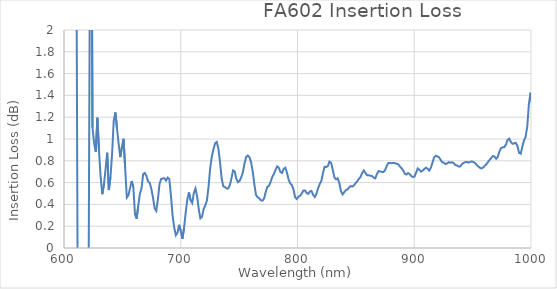
| Category | Series 0 |
|---|---|
| 355.6 | -12.475 |
| 357.0 | -5.149 |
| 358.4 | 5.273 |
| 359.8 | 20.017 |
| 361.2 | 34.593 |
| 362.6 | 42.109 |
| 364.0 | 31.907 |
| 365.4 | 35.288 |
| 366.8 | 31.769 |
| 368.2 | 21.881 |
| 369.6 | 14.716 |
| 371.0 | 4.2 |
| 372.4 | -5.747 |
| 373.8 | 8.65 |
| 375.2 | 8.643 |
| 376.6 | 4.934 |
| 378.0 | 0.977 |
| 379.4 | -2.68 |
| 380.8 | -2.784 |
| 382.2 | 0.235 |
| 383.6 | -3.64 |
| 385.0 | -7.265 |
| 386.4 | -3.585 |
| 387.8 | -10.357 |
| 389.2 | -6.478 |
| 390.6 | -2.831 |
| 392.0 | -6.147 |
| 393.4 | -9.588 |
| 394.8 | -5.664 |
| 396.2 | -5.493 |
| 397.6 | 11.924 |
| 399.0 | 11.547 |
| 400.4 | 11.53 |
| 401.8 | 22.085 |
| 403.2 | 25.629 |
| 404.6 | 14.497 |
| 406.0 | 7.05 |
| 407.4 | -0.007 |
| 408.8 | 3.761 |
| 410.2 | 8.017 |
| 411.6 | 11.542 |
| 413.0 | 1.079 |
| 414.4 | 1.284 |
| 415.8 | 4.873 |
| 417.2 | 4.856 |
| 418.6 | 4.667 |
| 420.0 | 6.533 |
| 421.4 | -1.03 |
| 422.8 | 5.857 |
| 424.2 | 20.126 |
| 425.6 | 23.821 |
| 427.0 | 23.746 |
| 428.4 | 13.81 |
| 429.8 | 11.035 |
| 431.2 | 4.179 |
| 432.6 | 7.481 |
| 434.0 | 10.685 |
| 435.4 | 10.771 |
| 436.8 | 18.04 |
| 438.2 | 21.395 |
| 439.6 | 14.895 |
| 441.0 | 11.885 |
| 442.4 | 15.489 |
| 443.8 | 8.804 |
| 445.2 | 5.662 |
| 446.6 | -4.639 |
| 448.0 | -1.38 |
| 449.4 | -1.157 |
| 450.8 | 9.169 |
| 452.2 | 2.187 |
| 453.6 | -4.588 |
| 455.0 | -4.909 |
| 456.4 | -8.916 |
| 457.8 | -19.832 |
| 459.2 | -17.027 |
| 460.6 | -20.219 |
| 462.0 | -12.741 |
| 463.4 | -9.546 |
| 464.8 | -6.248 |
| 466.2 | -6.088 |
| 467.6 | 5.15 |
| 469.0 | 19.215 |
| 470.4 | 22.183 |
| 471.8 | 11.186 |
| 473.2 | 21.516 |
| 474.6 | 28.773 |
| 476.0 | 46.771 |
| 477.4 | 50.262 |
| 478.8 | 42.88 |
| 480.2 | 42.836 |
| 481.6 | 53.231 |
| 483.0 | 49.815 |
| 484.4 | 35.627 |
| 485.8 | 21.128 |
| 487.2 | 13.645 |
| 488.6 | 6.838 |
| 490.0 | -3.842 |
| 491.4 | -14.295 |
| 492.8 | -24.955 |
| 494.2 | -25.079 |
| 495.6 | -24.687 |
| 497.0 | -17.643 |
| 498.4 | -6.627 |
| 499.8 | 14.721 |
| 501.2 | 28.531 |
| 502.6 | 31.545 |
| 504.0 | 38.136 |
| 505.4 | 41.372 |
| 506.8 | 34.602 |
| 508.2 | 27.647 |
| 509.6 | 10.55 |
| 511.0 | 0.227 |
| 512.4 | 0.791 |
| 513.8 | 1.543 |
| 515.2 | -2.099 |
| 516.6 | -9.316 |
| 518.0 | -23.454 |
| 519.4 | -27.318 |
| 520.8 | -30.835 |
| 522.2 | -38.31 |
| 523.6 | -42.491 |
| 525.0 | -35.283 |
| 526.4 | -28.549 |
| 527.8 | -29.213 |
| 529.2 | -30.128 |
| 530.6 | -30.352 |
| 532.0 | -23.186 |
| 533.4 | -8.47 |
| 534.8 | -1.672 |
| 536.2 | -5.12 |
| 537.6 | 5.735 |
| 539.0 | 16.53 |
| 540.4 | 16.678 |
| 541.8 | 16.805 |
| 543.2 | -1.101 |
| 544.6 | -14.822 |
| 546.0 | -11.28 |
| 547.4 | -21.973 |
| 548.8 | -35.906 |
| 550.2 | -36.291 |
| 551.6 | -40.059 |
| 553.0 | -36.523 |
| 554.4 | -40.578 |
| 555.8 | -40.736 |
| 557.2 | -37.196 |
| 558.6 | -25.962 |
| 560.0 | -21.942 |
| 561.4 | -14.295 |
| 562.8 | -13.75 |
| 564.2 | 0.108 |
| 565.6 | 7.254 |
| 567.0 | 14.549 |
| 568.4 | 7.208 |
| 569.8 | 3.955 |
| 571.2 | -6.875 |
| 572.6 | -7.42 |
| 574.0 | -17.272 |
| 575.4 | -31.381 |
| 576.8 | -35.025 |
| 578.2 | -31.855 |
| 579.6 | -28.606 |
| 581.0 | -24.596 |
| 582.4 | -24.435 |
| 583.8 | -20.877 |
| 585.2 | -6.57 |
| 586.6 | 4.055 |
| 588.0 | 8.086 |
| 589.4 | 12.012 |
| 590.8 | 22.654 |
| 592.2 | 30.337 |
| 593.6 | 37.868 |
| 595.0 | 38.292 |
| 596.4 | 31.766 |
| 597.8 | 31.636 |
| 599.2 | 31.593 |
| 600.6 | 31.749 |
| 602.0 | 24.585 |
| 603.4 | 20.218 |
| 604.8 | 16.307 |
| 606.2 | 15.876 |
| 607.6 | 15.624 |
| 609.0 | 11.469 |
| 610.4 | 3.466 |
| 611.8 | -0.685 |
| 613.2 | -7.441 |
| 614.6 | -3.85 |
| 616.0 | -3.768 |
| 617.4 | -3.542 |
| 618.8 | -3.165 |
| 620.2 | -2.665 |
| 621.6 | 1.079 |
| 623.0 | 4.672 |
| 624.4 | 1.105 |
| 625.8 | 0.962 |
| 627.2 | 0.882 |
| 628.6 | 1.195 |
| 630.0 | 0.89 |
| 631.4 | 0.647 |
| 632.8 | 0.494 |
| 634.2 | 0.583 |
| 635.6 | 0.721 |
| 637.0 | 0.875 |
| 638.4 | 0.532 |
| 639.8 | 0.651 |
| 641.2 | 0.864 |
| 642.6 | 1.168 |
| 644.0 | 1.243 |
| 645.4 | 1.097 |
| 646.8 | 0.955 |
| 648.2 | 0.834 |
| 649.6 | 0.926 |
| 651.0 | 1.002 |
| 652.4 | 0.732 |
| 653.8 | 0.463 |
| 655.2 | 0.483 |
| 656.6 | 0.551 |
| 658.0 | 0.614 |
| 659.4 | 0.556 |
| 660.8 | 0.309 |
| 662.2 | 0.269 |
| 663.6 | 0.387 |
| 665.0 | 0.497 |
| 666.4 | 0.548 |
| 667.8 | 0.678 |
| 669.2 | 0.688 |
| 670.6 | 0.661 |
| 672.0 | 0.611 |
| 673.4 | 0.598 |
| 674.8 | 0.544 |
| 676.2 | 0.464 |
| 677.6 | 0.365 |
| 679.0 | 0.34 |
| 680.4 | 0.442 |
| 681.8 | 0.586 |
| 683.2 | 0.633 |
| 684.6 | 0.639 |
| 686.0 | 0.64 |
| 687.4 | 0.619 |
| 688.8 | 0.645 |
| 690.2 | 0.633 |
| 691.6 | 0.481 |
| 693.0 | 0.3 |
| 694.4 | 0.187 |
| 695.8 | 0.117 |
| 697.2 | 0.14 |
| 698.6 | 0.213 |
| 700.0 | 0.156 |
| 701.4 | 0.084 |
| 702.8 | 0.181 |
| 704.2 | 0.322 |
| 705.6 | 0.444 |
| 707.0 | 0.51 |
| 708.4 | 0.44 |
| 709.8 | 0.413 |
| 711.2 | 0.505 |
| 712.6 | 0.546 |
| 714.0 | 0.475 |
| 715.4 | 0.357 |
| 716.8 | 0.271 |
| 718.2 | 0.286 |
| 719.6 | 0.357 |
| 721.0 | 0.392 |
| 722.4 | 0.434 |
| 723.8 | 0.562 |
| 725.2 | 0.73 |
| 726.6 | 0.838 |
| 728.0 | 0.905 |
| 729.4 | 0.96 |
| 730.8 | 0.973 |
| 732.2 | 0.914 |
| 733.6 | 0.791 |
| 735.0 | 0.641 |
| 736.4 | 0.566 |
| 737.8 | 0.56 |
| 739.2 | 0.545 |
| 740.6 | 0.545 |
| 742.0 | 0.575 |
| 743.4 | 0.637 |
| 744.8 | 0.712 |
| 746.2 | 0.704 |
| 747.6 | 0.634 |
| 749.0 | 0.604 |
| 750.4 | 0.615 |
| 751.8 | 0.649 |
| 753.2 | 0.694 |
| 754.6 | 0.775 |
| 756.0 | 0.835 |
| 757.4 | 0.848 |
| 758.8 | 0.833 |
| 760.2 | 0.79 |
| 761.6 | 0.705 |
| 763.0 | 0.588 |
| 764.4 | 0.488 |
| 765.8 | 0.466 |
| 767.2 | 0.455 |
| 768.6 | 0.437 |
| 770.0 | 0.434 |
| 771.4 | 0.455 |
| 772.8 | 0.514 |
| 774.2 | 0.562 |
| 775.6 | 0.57 |
| 777.0 | 0.607 |
| 778.4 | 0.652 |
| 779.8 | 0.68 |
| 781.2 | 0.717 |
| 782.6 | 0.749 |
| 784.0 | 0.735 |
| 785.4 | 0.696 |
| 786.8 | 0.689 |
| 788.2 | 0.727 |
| 789.6 | 0.737 |
| 791.0 | 0.69 |
| 792.4 | 0.628 |
| 793.8 | 0.591 |
| 795.2 | 0.579 |
| 796.6 | 0.535 |
| 798.0 | 0.465 |
| 799.4 | 0.45 |
| 800.8 | 0.469 |
| 802.2 | 0.479 |
| 803.6 | 0.498 |
| 805.0 | 0.526 |
| 806.4 | 0.528 |
| 807.8 | 0.504 |
| 809.2 | 0.496 |
| 810.6 | 0.519 |
| 812.0 | 0.524 |
| 813.4 | 0.487 |
| 814.8 | 0.467 |
| 816.2 | 0.495 |
| 817.6 | 0.548 |
| 819.0 | 0.585 |
| 820.4 | 0.615 |
| 821.8 | 0.685 |
| 823.2 | 0.745 |
| 824.6 | 0.743 |
| 826.0 | 0.751 |
| 827.4 | 0.793 |
| 828.8 | 0.782 |
| 830.2 | 0.716 |
| 831.6 | 0.649 |
| 833.0 | 0.63 |
| 834.4 | 0.639 |
| 835.8 | 0.598 |
| 837.2 | 0.521 |
| 838.6 | 0.491 |
| 840.0 | 0.512 |
| 841.4 | 0.53 |
| 842.8 | 0.537 |
| 844.2 | 0.556 |
| 845.6 | 0.568 |
| 847.0 | 0.564 |
| 848.4 | 0.575 |
| 849.8 | 0.596 |
| 851.2 | 0.612 |
| 852.6 | 0.635 |
| 854.0 | 0.652 |
| 855.4 | 0.688 |
| 856.8 | 0.712 |
| 858.2 | 0.688 |
| 859.6 | 0.668 |
| 861.0 | 0.668 |
| 862.4 | 0.662 |
| 863.8 | 0.661 |
| 865.2 | 0.645 |
| 866.6 | 0.639 |
| 868.0 | 0.677 |
| 869.4 | 0.705 |
| 870.8 | 0.703 |
| 872.2 | 0.698 |
| 873.6 | 0.696 |
| 875.0 | 0.714 |
| 876.4 | 0.752 |
| 877.8 | 0.78 |
| 879.2 | 0.78 |
| 880.6 | 0.778 |
| 882.0 | 0.78 |
| 883.4 | 0.778 |
| 884.8 | 0.773 |
| 886.2 | 0.768 |
| 887.6 | 0.749 |
| 889.0 | 0.733 |
| 890.4 | 0.715 |
| 891.8 | 0.683 |
| 893.2 | 0.674 |
| 894.6 | 0.688 |
| 896.0 | 0.679 |
| 897.4 | 0.66 |
| 898.8 | 0.651 |
| 900.2 | 0.655 |
| 901.6 | 0.692 |
| 903.0 | 0.73 |
| 904.4 | 0.716 |
| 905.8 | 0.701 |
| 907.2 | 0.71 |
| 908.6 | 0.724 |
| 910.0 | 0.737 |
| 911.4 | 0.728 |
| 912.8 | 0.71 |
| 914.2 | 0.735 |
| 915.6 | 0.784 |
| 917.0 | 0.83 |
| 918.4 | 0.847 |
| 919.8 | 0.84 |
| 921.2 | 0.833 |
| 922.6 | 0.808 |
| 924.0 | 0.786 |
| 925.4 | 0.782 |
| 926.8 | 0.77 |
| 928.2 | 0.776 |
| 929.6 | 0.788 |
| 931.0 | 0.782 |
| 932.4 | 0.786 |
| 933.8 | 0.779 |
| 935.2 | 0.761 |
| 936.6 | 0.757 |
| 938.0 | 0.748 |
| 939.4 | 0.749 |
| 940.8 | 0.769 |
| 942.2 | 0.78 |
| 943.6 | 0.788 |
| 945.0 | 0.79 |
| 946.4 | 0.783 |
| 947.8 | 0.789 |
| 949.2 | 0.795 |
| 950.6 | 0.789 |
| 952.0 | 0.78 |
| 953.4 | 0.764 |
| 954.8 | 0.748 |
| 956.2 | 0.736 |
| 957.6 | 0.73 |
| 959.0 | 0.739 |
| 960.4 | 0.754 |
| 961.8 | 0.769 |
| 963.2 | 0.79 |
| 964.6 | 0.808 |
| 966.0 | 0.826 |
| 967.4 | 0.844 |
| 968.8 | 0.839 |
| 970.2 | 0.819 |
| 971.6 | 0.837 |
| 973.0 | 0.888 |
| 974.4 | 0.918 |
| 975.8 | 0.923 |
| 977.2 | 0.926 |
| 978.6 | 0.95 |
| 980.0 | 0.993 |
| 981.4 | 1.003 |
| 982.8 | 0.972 |
| 984.2 | 0.956 |
| 985.6 | 0.961 |
| 987.0 | 0.965 |
| 988.4 | 0.934 |
| 989.8 | 0.872 |
| 991.2 | 0.865 |
| 992.6 | 0.931 |
| 994.0 | 0.986 |
| 995.4 | 1.022 |
| 996.8 | 1.115 |
| 998.2 | 1.322 |
| 999.6 | 1.425 |
| 1001.0 | 1.316 |
| 1002.4 | 1.173 |
| 1003.8 | 1.114 |
| 1005.2 | 1.072 |
| 1006.6 | 0.935 |
| 1008.0 | 0.57 |
| 1009.4 | 0.209 |
| 1010.8 | -0.3 |
| 1012.2 | -3.416 |
| 1013.6 | -3.239 |
| 1015.0 | -3.256 |
| 1016.4 | 3.564 |
| 1017.8 | 7.424 |
| 1019.2 | 14.491 |
| 1020.6 | 14.978 |
| 1022.0 | 14.805 |
| 1023.4 | 11.521 |
| 1024.8 | 8.148 |
| 1026.2 | -2.098 |
| 1027.6 | -9.616 |
| 1029.0 | -16.646 |
| 1030.4 | -19.781 |
| 1031.8 | -16.428 |
| 1033.2 | -13.809 |
| 1034.6 | -11.032 |
| 1036.0 | -7.563 |
| 1037.4 | -3.944 |
| 1038.8 | -0.866 |
| 1040.2 | -1.434 |
| 1041.6 | 5.06 |
| 1043.0 | 2.26 |
| 1044.4 | -1.019 |
| 1045.8 | -14.19 |
| 1047.2 | -20.843 |
| 1048.6 | -27.17 |
| 1050.0 | -26.937 |
| 1051.4 | -43.47 |
| 1052.8 | -47.011 |
| 1054.2 | -46.705 |
| 1055.6 | -37.038 |
| 1057.0 | -33.669 |
| 1058.4 | -26.814 |
| 1059.8 | -26.213 |
| 1061.2 | -19.526 |
| 1062.6 | -5.953 |
| 1064.0 | 0.758 |
| 1065.4 | 4.18 |
| 1066.8 | 1.24 |
| 1068.2 | -9.138 |
| 1069.6 | -13.127 |
| 1071.0 | -13.071 |
| 1072.4 | -22.857 |
| 1073.8 | -22.642 |
| 1075.2 | -22.745 |
| 1076.6 | -13.054 |
| 1078.0 | -12.526 |
| 1079.4 | -12.578 |
| 1080.8 | -12.62 |
| 1082.2 | -9.658 |
| 1083.6 | -9.718 |
| 1085.0 | -6.512 |
| 1086.4 | -6.682 |
| 1087.8 | -0.207 |
| 1089.2 | 3.414 |
| 1090.6 | 6.715 |
| 1092.0 | 13.514 |
| 1093.4 | 20.64 |
| 1094.8 | 24.435 |
| 1096.2 | 17.866 |
| 1097.6 | 11.001 |
| 1099.0 | 3.962 |
| 1100.4 | -6.312 |
| 1101.8 | -20.264 |
| 1103.2 | -30.745 |
| 1104.6 | -37.858 |
| 1106.0 | -28.316 |
| 1107.4 | -18.263 |
| 1108.8 | -1.445 |
| 1110.2 | 8.806 |
| 1111.6 | 16.125 |
| 1113.0 | 22.538 |
| 1114.4 | 19.2 |
| 1115.8 | 6.38 |
| 1117.2 | -6.7 |
| 1118.6 | -13.233 |
| 1120.0 | -6.505 |
| 1121.4 | 0.232 |
| 1122.8 | 4.073 |
| 1124.2 | 11.159 |
| 1125.6 | 27.803 |
| 1127.0 | 44.403 |
| 1128.4 | 47.813 |
| 1129.8 | 44.474 |
| 1131.2 | 37.522 |
| 1132.6 | 33.63 |
| 1134.0 | 26.588 |
| 1135.4 | 12.896 |
| 1136.8 | -0.523 |
| 1138.2 | -3.894 |
| 1139.6 | -7.52 |
| 1141.0 | -10.854 |
| 1142.4 | -17.353 |
| 1143.8 | -17.535 |
| 1145.2 | -10.502 |
| 1146.6 | -7.233 |
| 1148.0 | -3.927 |
| 1149.4 | -10.507 |
| 1150.8 | -7.696 |
| 1152.2 | -14.405 |
| 1153.6 | -14.411 |
| 1155.0 | -14.677 |
| 1156.4 | -17.931 |
| 1157.8 | -21.921 |
| 1159.2 | -18.398 |
| 1160.6 | -17.777 |
| 1162.0 | -17.607 |
| 1163.4 | -17.231 |
| 1164.8 | -26.991 |
| 1166.2 | -27.133 |
| 1167.6 | -39.386 |
| 1169.0 | -49.302 |
| 1170.4 | -49.468 |
| 1171.8 | -36.282 |
| 1173.2 | -32.67 |
| 1174.6 | -25.747 |
| 1176.0 | -22.214 |
| 1177.4 | -9.311 |
| 1178.8 | 7.194 |
| 1180.2 | 7.971 |
| 1181.6 | 5.05 |
| 1183.0 | 4.924 |
| 1184.4 | 1.551 |
| 1185.8 | -1.982 |
| 1187.2 | -1.884 |
| 1188.6 | -1.937 |
| 1190.0 | 10.341 |
| 1191.4 | 6.932 |
| 1192.8 | 0.072 |
| 1194.2 | -6.424 |
| 1195.6 | -9.549 |
| 1197.0 | -16.203 |
| 1198.4 | -29.582 |
| 1199.8 | -49.065 |
| 1201.2 | -45.755 |
| 1202.6 | -32.491 |
| 1204.0 | -15.803 |
| 1205.4 | -5.638 |
| 1206.8 | 10.386 |
| 1208.2 | 16.854 |
| 1209.6 | 26.5 |
| 1211.0 | 29.566 |
| 1212.4 | 26.474 |
| 1213.8 | 23.005 |
| 1215.2 | 29.281 |
| 1216.6 | 23.002 |
| 1218.0 | 26.492 |
| 1219.4 | 19.627 |
| 1220.8 | 9.457 |
| 1222.2 | 8.478 |
| 1223.6 | 1.507 |
| 1225.0 | -8.333 |
| 1226.4 | -21.383 |
| 1227.8 | -24.628 |
| 1229.2 | -14.358 |
| 1230.6 | -10.668 |
| 1232.0 | -16.51 |
| 1233.4 | -20.22 |
| 1234.8 | -17.331 |
| 1236.2 | -1.193 |
| 1237.6 | 12.094 |
| 1239.0 | 12.583 |
| 1240.4 | 9.015 |
| 1241.8 | 8.695 |
| 1243.2 | 12.57 |
| 1244.6 | 13.707 |
| 1246.0 | 10.884 |
| 1247.4 | -2.289 |
| 1248.8 | -2.782 |
| 1250.2 | 4.03 |
| 1251.6 | 4.432 |
| 1253.0 | 0.609 |
| 1254.4 | -0.321 |
| 1255.8 | 2.949 |
| 1257.2 | 16.152 |
| 1258.6 | 12.812 |
| 1260.0 | 3.056 |
| 1261.4 | 2.832 |
| 1262.8 | 9.592 |
| 1264.2 | 6.452 |
| 1265.6 | -0.027 |
| 1267.0 | -6.273 |
| 1268.4 | -2.817 |
| 1269.8 | 13.532 |
| 1271.2 | 17.275 |
| 1272.6 | 20.844 |
| 1274.0 | 24.232 |
| 1275.4 | 20.673 |
| 1276.8 | 23.935 |
| 1278.2 | 17.278 |
| 1279.6 | 3.544 |
| 1281.0 | -0.701 |
| 1282.4 | -14.333 |
| 1283.8 | -17.963 |
| 1285.2 | -18.39 |
| 1286.6 | -28.65 |
| 1288.0 | -32.34 |
| 1289.4 | -32.046 |
| 1290.8 | -37.427 |
| 1292.2 | -30.703 |
| 1293.6 | -30.556 |
| 1295.0 | -30.067 |
| 1296.4 | -30.251 |
| 1297.8 | -30.064 |
| 1299.2 | -26.538 |
| 1300.6 | -16.813 |
| 1302.0 | -17.047 |
| 1303.4 | -20.092 |
| 1304.8 | -16.915 |
| 1306.2 | -16.931 |
| 1307.6 | -13.197 |
| 1309.0 | -6.446 |
| 1310.4 | -6.756 |
| 1311.8 | -0.699 |
| 1313.2 | -3.75 |
| 1314.6 | -3.675 |
| 1316.0 | -9.369 |
| 1317.4 | -15.704 |
| 1318.8 | -22.515 |
| 1320.2 | -16.384 |
| 1321.6 | -18.453 |
| 1323.0 | -5.618 |
| 1324.4 | -5.458 |
| 1325.8 | 0.815 |
| 1327.2 | 7.09 |
| 1328.6 | 14.212 |
| 1330.0 | 11.167 |
| 1331.4 | 7.059 |
| 1332.8 | 6.702 |
| 1334.2 | 3.575 |
| 1335.6 | -3.652 |
| 1337.0 | -17.363 |
| 1338.4 | -37.879 |
| 1339.8 | -41.308 |
| 1341.2 | -37.747 |
| 1342.6 | -37.382 |
| 1344.0 | -34.538 |
| 1345.4 | -37.777 |
| 1346.8 | -33.898 |
| 1348.2 | -13.845 |
| 1349.6 | -6.99 |
| 1351.0 | -3.475 |
| 1352.4 | -6.906 |
| 1353.8 | -10.081 |
| 1355.2 | 3.046 |
| 1356.6 | 16.224 |
| 1358.0 | 16.575 |
| 1359.4 | 13.366 |
| 1360.8 | 10.001 |
| 1362.2 | 6.028 |
| 1363.6 | 5.286 |
| 1365.0 | -1.124 |
| 1366.4 | -1.225 |
| 1367.8 | -1.315 |
| 1369.2 | -1.894 |
| 1370.6 | -5.114 |
| 1372.0 | 1.838 |
| 1373.4 | 9.222 |
| 1374.8 | 12.696 |
| 1376.2 | 12.343 |
| 1377.6 | 1.614 |
| 1379.0 | -1.609 |
| 1380.4 | -1.726 |
| 1381.8 | -4.764 |
| 1383.2 | -4.649 |
| 1384.6 | 5.254 |
| 1386.0 | 2.073 |
| 1387.4 | 2.583 |
| 1388.8 | 2.876 |
| 1390.2 | 6.305 |
| 1391.6 | 9.32 |
| 1393.0 | 2.277 |
| 1394.4 | -11.747 |
| 1395.8 | -15.131 |
| 1397.2 | -15.108 |
| 1398.6 | -21.457 |
| 1400.0 | -27.881 |
| 1401.4 | -30.738 |
| 1402.8 | -27.41 |
| 1404.2 | -26.677 |
| 1405.6 | -26.3 |
| 1407.0 | -23.016 |
| 1408.4 | -19.673 |
| 1409.8 | -10.22 |
| 1411.2 | -6.653 |
| 1412.6 | -2.65 |
| 1414.0 | -2.737 |
| 1415.4 | -6.648 |
| 1416.8 | -13.575 |
| 1418.2 | -14.047 |
| 1419.6 | -17.196 |
| 1421.0 | -17.626 |
| 1422.4 | -28.057 |
| 1423.8 | -31.527 |
| 1425.2 | -30.987 |
| 1426.6 | -24.001 |
| 1428.0 | -26.926 |
| 1429.4 | -30.26 |
| 1430.8 | -36.859 |
| 1432.2 | -30.375 |
| 1433.6 | -16.898 |
| 1435.0 | -10.187 |
| 1436.4 | -6.784 |
| 1437.8 | -0.107 |
| 1439.2 | 0.179 |
| 1440.6 | -2.993 |
| 1442.0 | -5.98 |
| 1443.4 | -15.751 |
| 1444.8 | -16.153 |
| 1446.2 | -25.95 |
| 1447.6 | -32.305 |
| 1449.0 | -28.713 |
| 1450.4 | -18.675 |
| 1451.8 | -12.101 |
| 1453.2 | 0.801 |
| 1454.6 | 4.303 |
| 1456.0 | 10.622 |
| 1457.4 | 23.266 |
| 1458.8 | 23.196 |
| 1460.2 | 20.102 |
| 1461.6 | 20.361 |
| 1463.0 | 20.421 |
| 1464.4 | 20.428 |
| 1465.8 | 20.897 |
| 1467.2 | 11.292 |
| 1468.6 | 0.939 |
| 1470.0 | -6.268 |
| 1471.4 | -16.848 |
| 1472.8 | -23.975 |
| 1474.2 | -30.447 |
| 1475.6 | -34.206 |
| 1477.0 | -37.998 |
| 1478.4 | -34.053 |
| 1479.8 | -23.658 |
| 1481.2 | -22.485 |
| 1482.6 | -28.46 |
| 1484.0 | -22.496 |
| 1485.4 | -22.581 |
| 1486.8 | -15.66 |
| 1488.2 | -9.492 |
| 1489.6 | -16.425 |
| 1491.0 | -14.037 |
| 1492.4 | -4.3 |
| 1493.8 | -0.874 |
| 1495.2 | 2.371 |
| 1496.6 | -0.939 |
| 1498.0 | -1.02 |
| 1499.4 | -4.232 |
| 1500.8 | 5.862 |
| 1502.2 | 6.404 |
| 1503.6 | 0.592 |
| 1505.0 | 7.516 |
| 1506.4 | 7.943 |
| 1507.8 | 1.827 |
| 1509.2 | 8.539 |
| 1510.6 | 5.095 |
| 1512.0 | -5.084 |
| 1513.4 | -11.92 |
| 1514.8 | -21.801 |
| 1516.2 | -18.465 |
| 1517.6 | -15.61 |
| 1519.0 | -22.366 |
| 1520.4 | -32.222 |
| 1521.8 | -28.997 |
| 1523.2 | -25.949 |
| 1524.6 | -26.29 |
| 1526.0 | -33.058 |
| 1527.4 | -32.99 |
| 1528.8 | -26.423 |
| 1530.2 | -19.584 |
| 1531.6 | -16.275 |
| 1533.0 | -9.47 |
| 1534.4 | -1.823 |
| 1535.8 | 11.439 |
| 1537.2 | 18.121 |
| 1538.6 | 24.323 |
| 1540.0 | 30.584 |
| 1541.4 | 37.219 |
| 1542.8 | 34.195 |
| 1544.2 | 30.16 |
| 1545.6 | 23.3 |
| 1547.0 | 16.598 |
| 1548.4 | 7.508 |
| 1549.8 | 7.436 |
| 1551.2 | 3.484 |
| 1552.6 | 3.303 |
| 1554.0 | 6.406 |
| 1555.4 | 9.714 |
| 1556.8 | 16.601 |
| 1558.2 | 16.724 |
| 1559.6 | 6.919 |
| 1561.0 | 7.504 |
| 1562.4 | 1.341 |
| 1563.8 | -2.768 |
| 1565.2 | -9.444 |
| 1566.6 | -12.916 |
| 1568.0 | -9.803 |
| 1569.4 | -2.777 |
| 1570.8 | -5.923 |
| 1572.2 | -3.306 |
| 1573.6 | -2.547 |
| 1575.0 | 0.642 |
| 1576.4 | 0.48 |
| 1577.8 | -3.222 |
| 1579.2 | -13.541 |
| 1580.6 | -16.961 |
| 1582.0 | -17.056 |
| 1583.4 | -17.144 |
| 1584.8 | -20.497 |
| 1586.2 | -27.026 |
| 1587.6 | -36.658 |
| 1589.0 | -33.37 |
| 1590.4 | -30.393 |
| 1591.8 | -23.519 |
| 1593.2 | -16.688 |
| 1594.6 | -3.331 |
| 1596.0 | 6.337 |
| 1597.4 | 16.272 |
| 1598.8 | 15.97 |
| 1600.2 | 9.5 |
| 1601.6 | 5.902 |
| 1603.0 | 2.548 |
| 1604.4 | -13.993 |
| 1605.8 | -23.749 |
| 1607.2 | -20.746 |
| 1608.6 | -17.002 |
| 1610.0 | -13.351 |
| 1611.4 | -3.388 |
| 1612.8 | -3.389 |
| 1614.2 | 3.487 |
| 1615.6 | 17.184 |
| 1617.0 | 20.497 |
| 1618.4 | 20.696 |
| 1619.8 | 20.487 |
| 1621.2 | 10.329 |
| 1622.6 | 3.675 |
| 1624.0 | 6.913 |
| 1625.4 | 6.733 |
| 1626.8 | 6.697 |
| 1628.2 | 3.014 |
| 1629.6 | 0.013 |
| 1631.0 | 0.179 |
| 1632.4 | 6.49 |
| 1633.8 | 13.226 |
| 1635.2 | 6.275 |
| 1636.6 | -0.129 |
| 1638.0 | -3.309 |
| 1639.4 | 2.825 |
| 1640.8 | -3.3 |
| 1642.2 | -12.555 |
| 1643.6 | -22.946 |
| 1645.0 | -22.781 |
| 1646.4 | -22.49 |
| 1647.8 | -15.719 |
| 1649.2 | -8.705 |
| 1650.6 | 7.49 |
| 1652.0 | 27.128 |
| 1653.4 | 40.724 |
| 1654.8 | 40.645 |
| 1656.2 | 46.599 |
| 1657.6 | 46.244 |
| 1659.0 | 35.832 |
| 1660.4 | 26.009 |
| 1661.8 | 16.208 |
| 1663.2 | 9.575 |
| 1664.6 | 9.113 |
| 1666.0 | 3.091 |
| 1667.4 | 6.581 |
| 1668.8 | 7.066 |
| 1670.2 | 10.683 |
| 1671.6 | 10.8 |
| 1673.0 | 4.273 |
| 1674.4 | -1.821 |
| 1675.8 | -2.254 |
| 1677.2 | -12.081 |
| 1678.6 | -9.045 |
| 1680.0 | -22.742 |
| 1681.4 | -33.248 |
| 1682.8 | -37.053 |
| 1684.2 | -26.855 |
| 1685.6 | -26.637 |
| 1687.0 | -26.815 |
| 1688.4 | -33.583 |
| 1689.8 | -26.952 |
| 1691.2 | -26.13 |
| 1692.6 | -15.619 |
| 1694.0 | -22.907 |
| 1695.4 | -30.698 |
| 1696.8 | -31.148 |
| 1698.2 | -24.4 |
| 1699.6 | -21.101 |
| 1701.0 | -11.6 |
| 1702.4 | -18.732 |
| 1703.8 | -15.137 |
| 1705.2 | -0.709 |
| 1706.6 | 6.428 |
| 1708.0 | 2.817 |
| 1709.4 | -4.183 |
| 1710.8 | -14.624 |
| 1712.2 | -10.913 |
| 1713.6 | -14.157 |
| 1715.0 | -24.676 |
| 1716.4 | -34.953 |
| 1717.8 | -34.698 |
| 1719.2 | -31.132 |
| 1720.6 | -27.728 |
| 1722.0 | -42.102 |
| 1723.4 | -39.232 |
| 1724.8 | -39.207 |
| 1726.2 | -36.347 |
| 1727.6 | -32.962 |
| 1729.0 | -25.882 |
| 1730.4 | -15.21 |
| 1731.8 | -4.038 |
| 1733.2 | 0.009 |
| 1734.6 | 7.114 |
| 1736.0 | 17.962 |
| 1737.4 | 21.496 |
| 1738.8 | 11.054 |
| 1740.2 | -10.48 |
| 1741.6 | -24.731 |
| 1743.0 | -31.271 |
| 1744.4 | -31.491 |
| 1745.8 | -31.86 |
| 1747.2 | -41.288 |
| 1748.6 | -39.96 |
| 1750.0 | -24.727 |